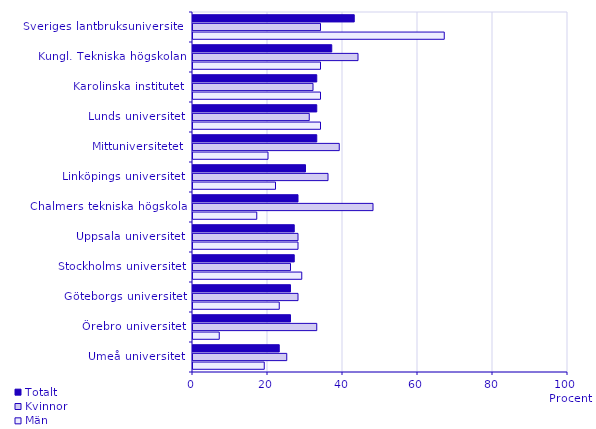
| Category | Totalt | Kvinnor | Män |
|---|---|---|---|
| Sveriges lantbruksuniversitet | 43 | 34 | 67 |
| Kungl. Tekniska högskolan | 37 | 44 | 34 |
| Karolinska institutet | 33 | 32 | 34 |
| Lunds universitet | 33 | 31 | 34 |
| Mittuniversitetet | 33 | 39 | 20 |
| Linköpings universitet | 30 | 36 | 22 |
| Chalmers tekniska högskola | 28 | 48 | 17 |
| Uppsala universitet | 27 | 28 | 28 |
| Stockholms universitet | 27 | 26 | 29 |
| Göteborgs universitet | 26 | 28 | 23 |
| Örebro universitet | 26 | 33 | 7 |
| Umeå universitet | 23 | 25 | 19 |